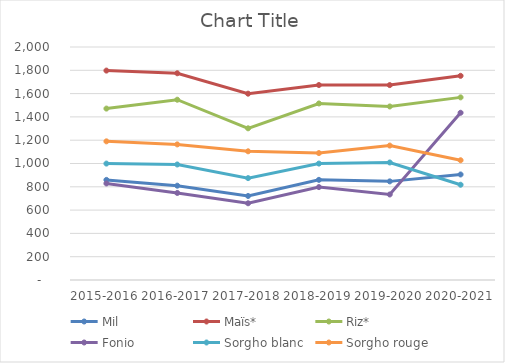
| Category |  Mil  |  Maïs*  |  Riz*  |  Fonio  |  Sorgho blanc  |  Sorgho rouge  |
|---|---|---|---|---|---|---|
| 2015-2016 | 859.194 | 1797.569 | 1471.4 | 828.784 | 999.284 | 1190.131 |
| 2016-2017 | 809.432 | 1774.603 | 1547.435 | 747.293 | 991.564 | 1163.925 |
| 2017-2018 | 721.231 | 1599.36 | 1302.064 | 658.627 | 874.523 | 1104.625 |
| 2018-2019 | 859.551 | 1673.486 | 1515.358 | 797.543 | 999.218 | 1089.488 |
| 2019-2020 | 846.59 | 1673.031 | 1489.536 | 734.075 | 1008.729 | 1153.922 |
| 2020-2021 | 905.815 | 1752.574 | 1567.632 | 1435.478 | 817.709 | 1027.849 |